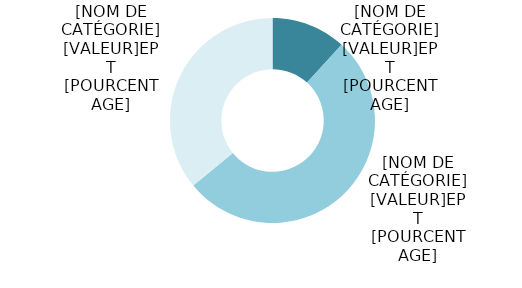
| Category | Series 0 |
|---|---|
| Corps professoral | 558.782 |
| Coll. ens. et recherche | 2484.035 |
| Pers. adm. et tech. | 1707.417 |